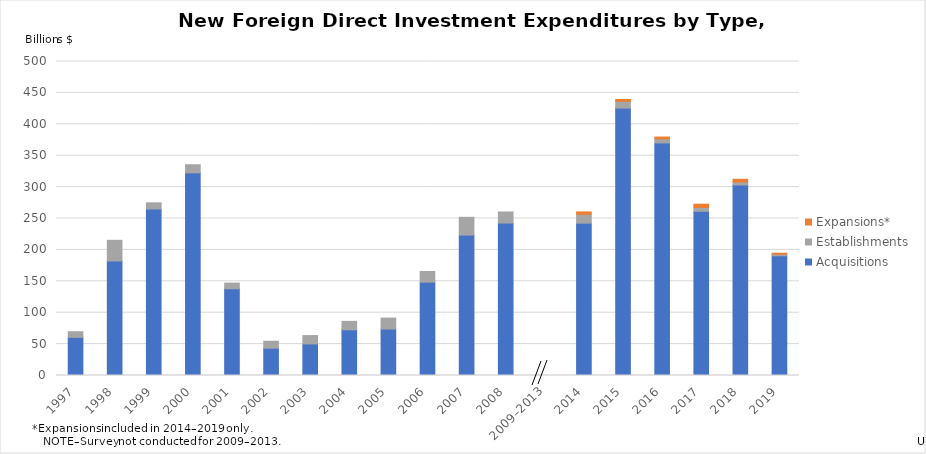
| Category | Acquisitions | Establishments | Expansions* |
|---|---|---|---|
| 1997 | 60.733 | 8.974 | 0 |
| 1998 | 182.357 | 32.899 | 0 |
| 1999 | 265.127 | 9.829 | 0 |
| 2000 | 322.703 | 12.926 | 0 |
| 2001 | 138.091 | 9.017 | 0 |
| 2002 | 43.442 | 11.077 | 0 |
| 2003 | 50.212 | 13.379 | 0 |
| 2004 | 72.738 | 13.481 | 0 |
| 2005 | 73.997 | 17.393 | 0 |
| 2006 | 148.604 | 16.999 | 0 |
| 2007 | 223.616 | 28.301 | 0 |
| 2008 | 242.799 | 17.564 | 0 |
| 2009–2013 | 0 | 0 | 0 |
| 2014 | 242.58 | 14.183 | 3.724 |
| 2015 | 425.788 | 10.739 | 3.037 |
| 2016 | 370.317 | 6.504 | 2.907 |
| 2017 | 261.455 | 6.044 | 5.257 |
| 2018 | 303.334 | 4.88 | 4.241 |
| 2019 | 190.651 | 2.503 | 1.507 |